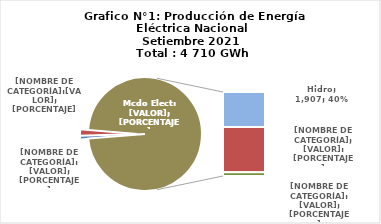
| Category | Series 0 |
|---|---|
| 0 | 37.753 |
| 1 | 84.03 |
| 2 | 1907.356 |
| 3 | 2481.405 |
| 4 | 199.6 |